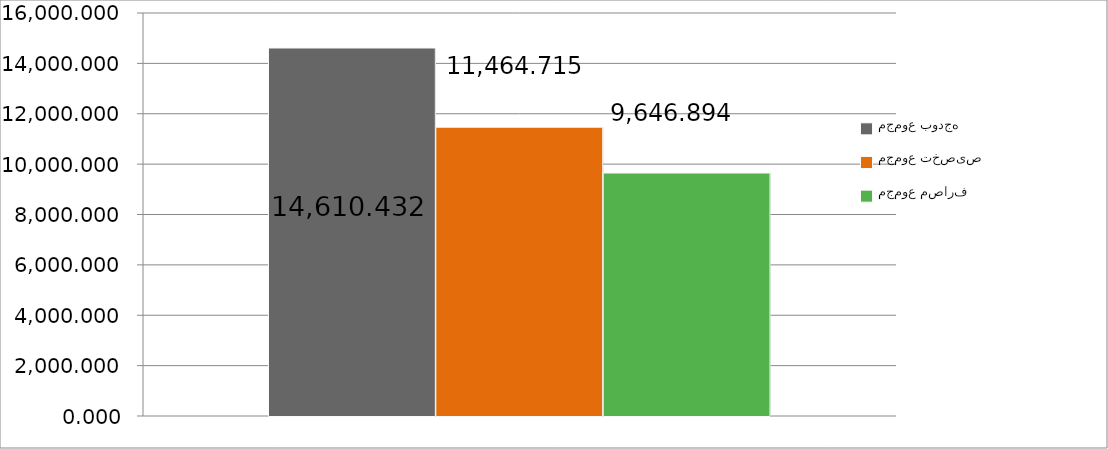
| Category | مجموع بودجه  | مجموع تخصیص | مجموع مصارف |
|---|---|---|---|
| 0 | 14610.432 | 11464.715 | 9646.894 |